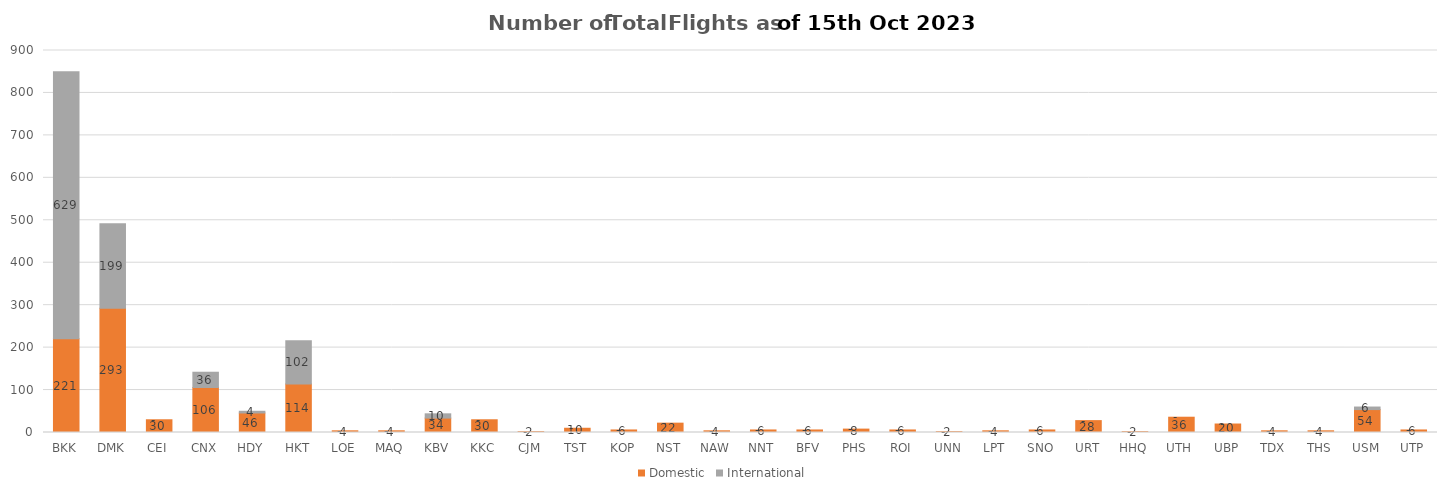
| Category | Domestic | International |
|---|---|---|
| BKK | 221 | 629 |
| DMK | 293 | 199 |
| CEI | 30 | 0 |
| CNX | 106 | 36 |
| HDY | 46 | 4 |
| HKT | 114 | 102 |
| LOE | 4 | 0 |
| MAQ | 4 | 0 |
| KBV | 34 | 10 |
| KKC | 30 | 0 |
| CJM | 2 | 0 |
| TST | 10 | 0 |
| KOP | 6 | 0 |
| NST | 22 | 0 |
| NAW | 4 | 0 |
| NNT | 6 | 0 |
| BFV | 6 | 0 |
| PHS | 8 | 0 |
| ROI | 6 | 0 |
| UNN | 2 | 0 |
| LPT | 4 | 0 |
| SNO | 6 | 0 |
| URT | 28 | 0 |
| HHQ | 2 | 0 |
| UTH | 36 | 0 |
| UBP | 20 | 0 |
| TDX | 4 | 0 |
| THS | 4 | 0 |
| USM | 54 | 6 |
| UTP | 6 | 0 |